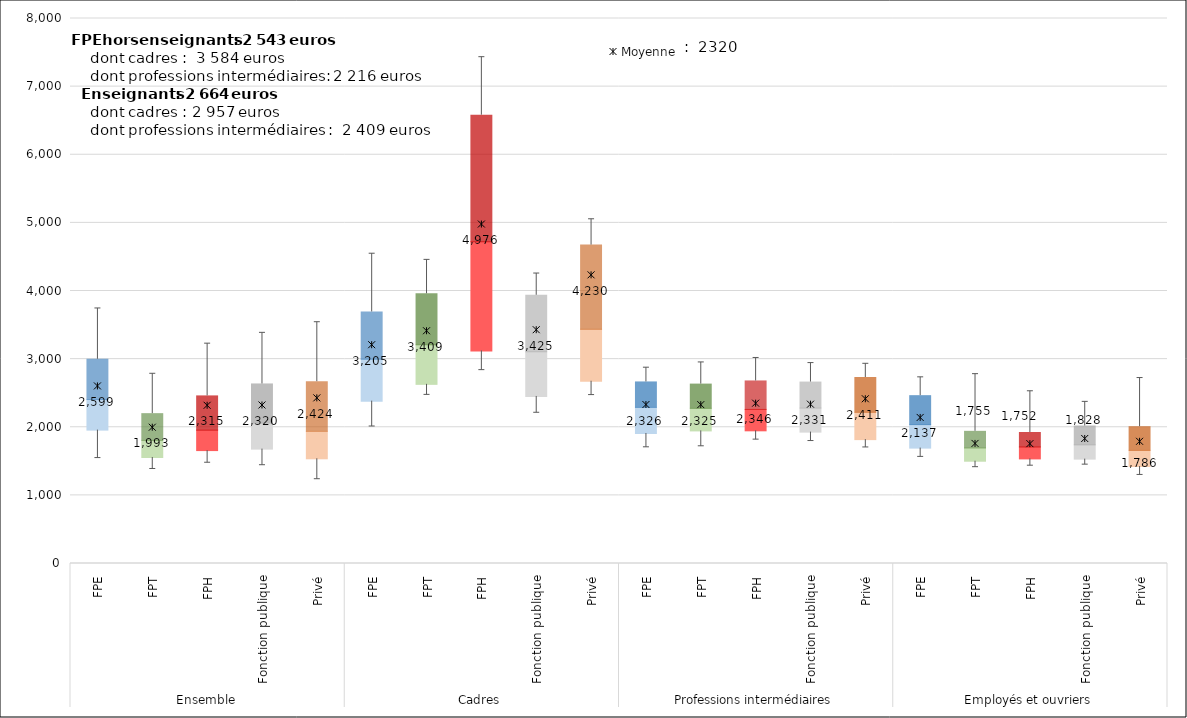
| Category | Series 0 | Series 1 | Series 2 | Q3-D5 | D9-Q3 |
|---|---|---|---|---|---|
| 0 | 1547.67 | 410.26 | 448.09 | 591.31 | 746.46 |
| 1 | 1387.32 | 168.76 | 251.34 | 392.25 | 585.18 |
| 2 | 1479 | 178.49 | 299.93 | 502.75 | 766.8 |
| 3 | 1442.71 | 236.29 | 382.33 | 574.34 | 750 |
| 4 | 1318.869 | 218.109 | 403.178 | 728.569 | 1175.387 |
| 5 | 1957.63 | 425.38 | 614.1 | 695.43 | 968.88 |
| 6 | 2175.75 | 453.94 | 579.81 | 749.75 | 892.83 |
| 7 | 2163.33 | 957.25 | 1601.84 | 1858.54 | 1282.71 |
| 8 | 1996.48 | 455.51 | 654.89 | 830.3 | 1300.99 |
| 9 | 2119.226 | 556.127 | 764.186 | 1234.72 | 2003.687 |
| 10 | 1372 | 536.4 | 383.77 | 373 | 434.55 |
| 11 | 1686.33 | 259.84 | 332 | 355.33 | 359 |
| 12 | 1708.67 | 238.87 | 314.21 | 417.83 | 349.25 |
| 13 | 1572.83 | 355.67 | 353 | 381.83 | 399.09 |
| 14 | 1508.815 | 309.656 | 401.166 | 510.566 | 662.232 |
| 15 | 1443.15 | 250.6 | 345.17 | 424.76 | 463.15 |
| 16 | 1355.58 | 145.75 | 195.06 | 243.64 | 280.19 |
| 17 | 1409 | 126.25 | 175.42 | 212 | 215.01 |
| 18 | 1377.92 | 154.08 | 209.75 | 276.92 | 347.5 |
| 19 | 1263.499 | 160.32 | 236.852 | 347.484 | 435.795 |